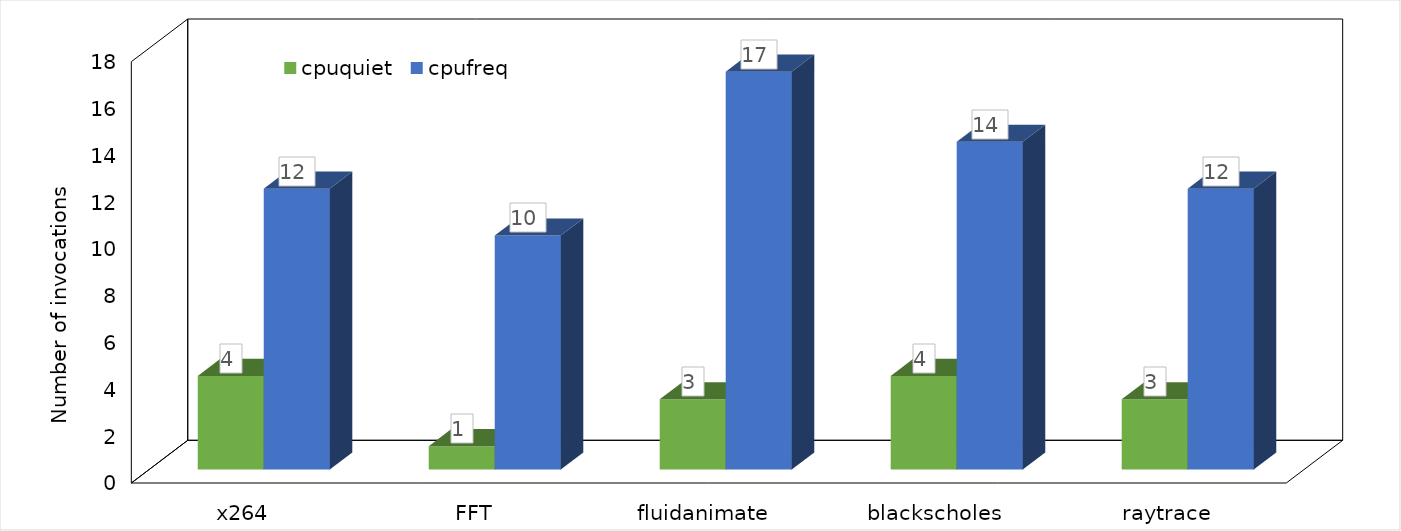
| Category | cpuquiet | cpufreq |
|---|---|---|
| x264 | 4 | 12 |
| FFT | 1 | 10 |
| fluidanimate | 3 | 17 |
| blackscholes | 4 | 14 |
| raytrace | 3 | 12 |